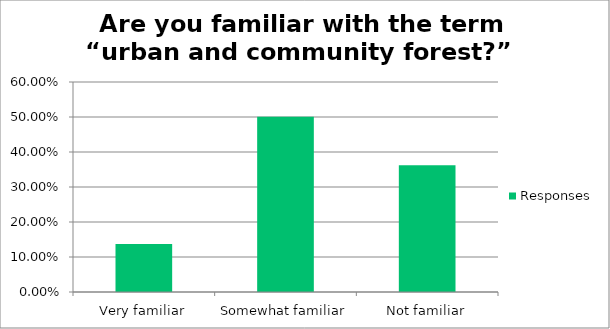
| Category | Responses |
|---|---|
| Very familiar | 0.137 |
| Somewhat familiar | 0.5 |
| Not familiar | 0.362 |